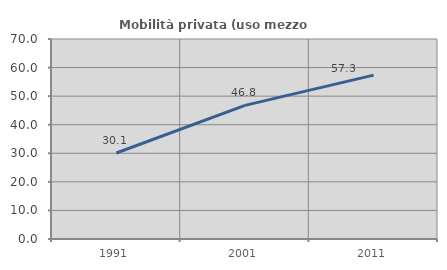
| Category | Mobilità privata (uso mezzo privato) |
|---|---|
| 1991.0 | 30.108 |
| 2001.0 | 46.767 |
| 2011.0 | 57.349 |